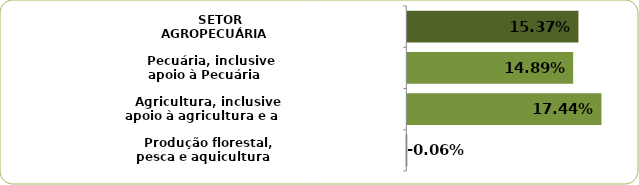
| Category | Series 0 |
|---|---|
|    Produção florestal, pesca e aquicultura | -0.001 |
|    Agricultura, inclusive apoio à agricultura e a pós-colheita | 0.174 |
|    Pecuária, inclusive apoio à Pecuária | 0.149 |
|    SETOR AGROPECUÁRIA | 0.154 |